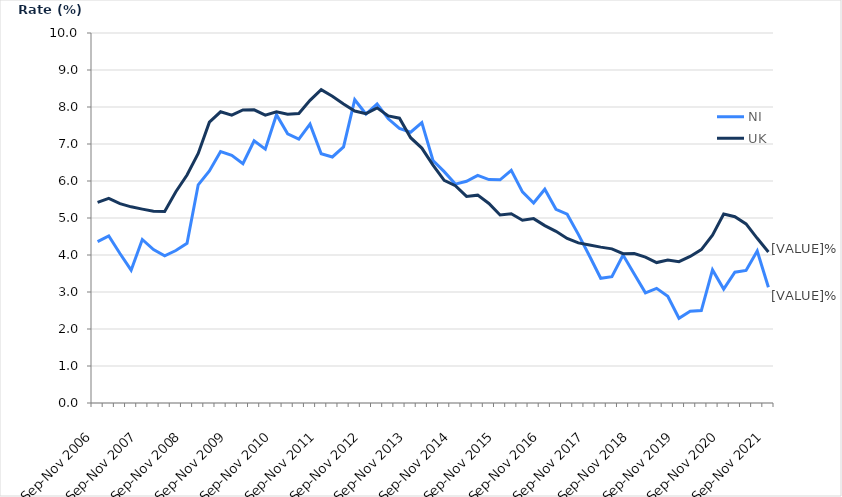
| Category | NI | UK |
|---|---|---|
| Sep-Nov 2006 | 4.361 | 5.42 |
| Dec-Feb 2007 | 4.516 | 5.53 |
| Mar-May 2007 | 4.04 | 5.389 |
| Jun-Aug 2007 | 3.589 | 5.302 |
| Sep-Nov 2007 | 4.419 | 5.239 |
| Dec-Feb 2008 | 4.146 | 5.181 |
| Mar-May 2008 | 3.979 | 5.179 |
| Jun-Aug 2008 | 4.122 | 5.71 |
| Sep-Nov 2008 | 4.317 | 6.163 |
| Dec-Feb 2009 | 5.897 | 6.744 |
| Mar-May 2009 | 6.27 | 7.59 |
| Jun-Aug 2009 | 6.796 | 7.87 |
| Sep-Nov 2009 | 6.693 | 7.781 |
| Dec-Feb 2010 | 6.47 | 7.92 |
| Mar-May 2010 | 7.085 | 7.923 |
| Jun-Aug 2010 | 6.862 | 7.782 |
| Sep-Nov 2010 | 7.791 | 7.871 |
| Dec-Feb 2011 | 7.277 | 7.803 |
| Mar-May 2011 | 7.133 | 7.822 |
| Jun-Aug 2011 | 7.538 | 8.181 |
| Sep-Nov 2011 | 6.736 | 8.467 |
| Dec-Feb 2012 | 6.65 | 8.289 |
| Mar-May 2012 | 6.922 | 8.08 |
| Jun-Aug 2012 | 8.196 | 7.89 |
| Sep-Nov 2012 | 7.81 | 7.82 |
| Dec-Feb 2013 | 8.083 | 7.976 |
| Mar-May 2013 | 7.68 | 7.758 |
| Jun-Aug 2013 | 7.422 | 7.698 |
| Sep-Nov 2013 | 7.318 | 7.17 |
| Dec-Feb 2014 | 7.578 | 6.889 |
| Mar-May 2014 | 6.554 | 6.428 |
| Jun-Aug 2014 | 6.253 | 6.019 |
| Sep-Nov 2014 | 5.916 | 5.871 |
| Dec-Feb 2015 | 5.991 | 5.583 |
| Mar-May 2015 | 6.154 | 5.617 |
| Jun-Aug 2015 | 6.039 | 5.392 |
| Sep-Nov 2015 | 6.033 | 5.081 |
| Dec-Feb 2016 | 6.288 | 5.113 |
| Mar-May 2016 | 5.706 | 4.939 |
| Jun-Aug 2016 | 5.404 | 4.983 |
| Sep-Nov 2016 | 5.778 | 4.794 |
| Dec-Feb 2017 | 5.235 | 4.64 |
| Mar-May 2017 | 5.102 | 4.445 |
| Jun-Aug 2017 | 4.558 | 4.328 |
| Sep-Nov 2017 | 3.974 | 4.272 |
| Dec-Feb 2018 | 3.371 | 4.213 |
| Mar-May 2018 | 3.416 | 4.165 |
| Jun-Aug 2018 | 3.999 | 4.035 |
| Sep-Nov 2018 | 3.486 | 4.039 |
| Dec-Feb 2019 | 2.979 | 3.942 |
| Mar-May 2019 | 3.099 | 3.796 |
| Jun-Aug 2019 | 2.886 | 3.863 |
| Sep-Nov 2019 | 2.289 | 3.819 |
| Dec-Feb 2020 | 2.483 | 3.961 |
| Mar-May 2020 | 2.498 | 4.147 |
| Jun-Aug 2020 | 3.598 | 4.538 |
| Sep-Nov 2020 | 3.079 | 5.107 |
| Dec-Feb 2021 | 3.537 | 5.035 |
| Mar-May 2021 | 3.582 | 4.839 |
| Jun-Aug 2021 | 4.11 | 4.451 |
| Sep-Nov 2021 | 3.129 | 4.083 |